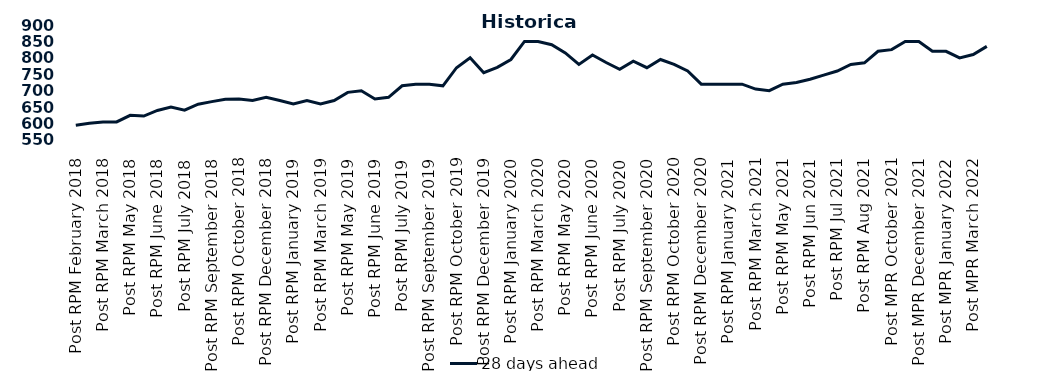
| Category | 28 days ahead |
|---|---|
| Post RPM February 2018 | 595 |
| Pre RPM March 2018 | 601 |
| Post RPM March 2018 | 605 |
| Pre RPM May 2018 | 605 |
| Post RPM May 2018 | 625 |
| Pre RPM June 2018 | 623 |
| Post RPM June 2018 | 640 |
| Pre RPM July 2018 | 650 |
| Post RPM July 2018 | 641 |
| Pre RPM September 2018 | 659 |
| Post RPM September 2018 | 666.75 |
| Pre RPM October 2018 | 674 |
| Post RPM October 2018 | 675 |
| Pre RPM December 2018 | 670 |
| Post RPM December 2018 | 680 |
| Pre RPM January 2019 | 670 |
| Post RPM January 2019 | 660 |
| Pre RPM March 2019 | 670 |
| Post RPM March 2019 | 660 |
| Pre RPM May 2019 | 670 |
| Post RPM May 2019 | 695 |
| Pre RPM June 2019 | 700 |
| Post RPM June 2019 | 675 |
| Pre RPM July 2019 | 680 |
| Post RPM July 2019 | 715 |
| Pre RPM September 2019 | 720 |
| Post RPM September 2019 | 720 |
| Pre RPM October 2019 | 715 |
| Post RPM October 2019 | 770 |
| Pre RPM December 2019 | 800 |
| Post RPM December 2019 | 755 |
| Pre RPM January 2020 | 771 |
| Post RPM January 2020 | 795 |
| Pre RPM March 2020 | 850 |
| Post RPM March 2020 | 850 |
| Pre RPM May 2020 | 840 |
| Post RPM May 2020 | 815 |
| Pre RPM June 2020 | 780 |
| Post RPM June 2020 | 809 |
| Pre RPM July 2020 | 785.72 |
| Post RPM July 2020 | 765 |
| Pre RPM September 2020 | 790 |
| Post RPM September 2020 | 770 |
| Pre RPM October 2020 | 795 |
| Post RPM October 2020 | 780 |
| Pre RPM December 2020 | 760 |
|  Post RPM December 2020 | 720 |
| Pre RPM January 2021 | 720 |
| Post RPM January 2021 | 720 |
|  Pre RPM March 2021 | 720 |
|  Post RPM March 2021 | 705 |
|  Pre RPM May 2021 | 700 |
|  Post RPM May 2021 | 720 |
|  Pre RPM Jun 2021 | 725 |
|   Post RPM Jun 2021 | 735 |
| Pre RPM Jul 2021 | 747.5 |
|  Post RPM Jul 2021 | 760 |
| Pre RPM Aug 2021 | 780 |
|  Post RPM Aug 2021 | 785 |
| Pre MPR October 2021 | 820 |
| Post MPR October 2021 | 825 |
| Pre MPR December 2021 | 850 |
| Post MPR December 2021 | 850 |
| Pre MPR January 2022 | 820 |
| Post MPR January 2022 | 820 |
| Pre MPR March 2022 | 800 |
| Post MPR March 2022 | 810 |
| Pre MPR May 2022 | 835 |